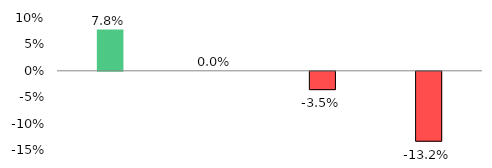
| Category | Series 1 |
|---|---|
| Advances | 0.078 |
| Performing Advances | 0 |
| Classified Advances | -0.035 |
| Non Fund Base Advances | -0.132 |